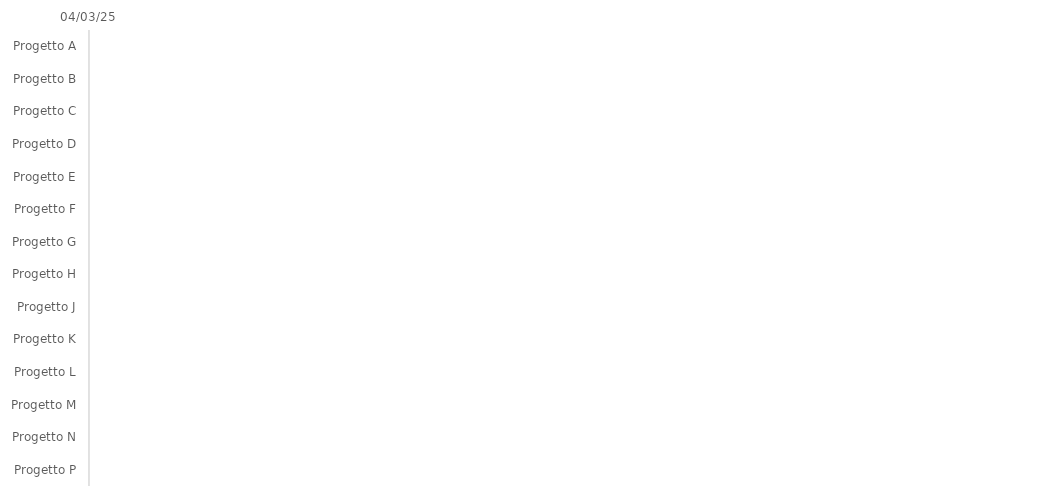
| Category | INIZIO | Durata |
|---|---|---|
| Progetto A |  | 0 |
| Progetto B |  | 0 |
| Progetto C |  | 0 |
| Progetto D |  | 0 |
| Progetto E |  | 0 |
| Progetto F |  | 0 |
| Progetto G |  | 0 |
| Progetto H |  | 0 |
| Progetto J |  | 0 |
| Progetto K |  | 0 |
| Progetto L |  | 0 |
| Progetto M |  | 0 |
| Progetto N |  | 0 |
| Progetto P |  | 0 |